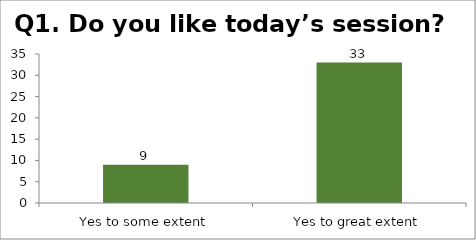
| Category | Q1. Do you like today’s session? |
|---|---|
| Yes to some extent | 9 |
| Yes to great extent | 33 |